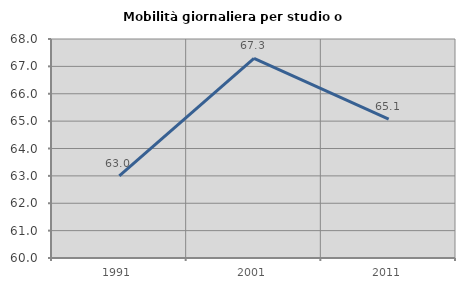
| Category | Mobilità giornaliera per studio o lavoro |
|---|---|
| 1991.0 | 62.998 |
| 2001.0 | 67.292 |
| 2011.0 | 65.076 |